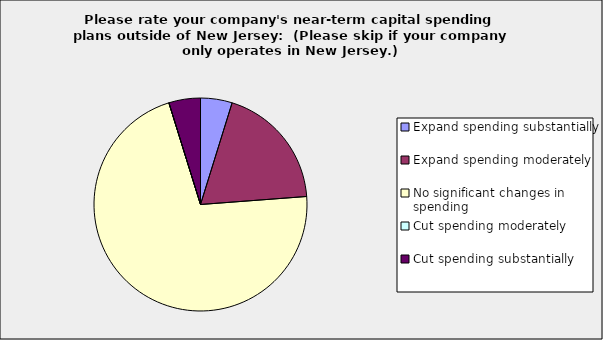
| Category | Series 0 |
|---|---|
| Expand spending substantially | 0.048 |
| Expand spending moderately | 0.19 |
| No significant changes in spending | 0.714 |
| Cut spending moderately | 0 |
| Cut spending substantially | 0.048 |